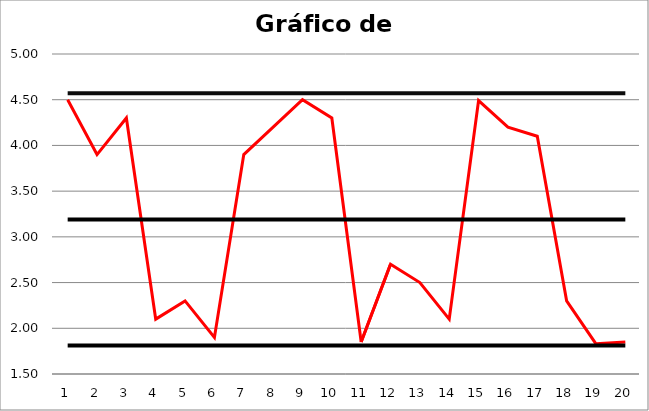
| Category | Promedio | LSC | LCC | LIC |
|---|---|---|---|---|
| 0 | 4.5 | 4.57 | 3.191 | 1.812 |
| 1 | 3.9 | 4.57 | 3.191 | 1.812 |
| 2 | 4.3 | 4.57 | 3.191 | 1.812 |
| 3 | 2.1 | 4.57 | 3.191 | 1.812 |
| 4 | 2.3 | 4.57 | 3.191 | 1.812 |
| 5 | 1.9 | 4.57 | 3.191 | 1.812 |
| 6 | 3.9 | 4.57 | 3.191 | 1.812 |
| 7 | 4.2 | 4.57 | 3.191 | 1.812 |
| 8 | 4.5 | 4.57 | 3.191 | 1.812 |
| 9 | 4.3 | 4.57 | 3.191 | 1.812 |
| 10 | 1.85 | 4.57 | 3.191 | 1.812 |
| 11 | 2.7 | 4.57 | 3.191 | 1.812 |
| 12 | 2.5 | 4.57 | 3.191 | 1.812 |
| 13 | 2.1 | 4.57 | 3.191 | 1.812 |
| 14 | 4.49 | 4.57 | 3.191 | 1.812 |
| 15 | 4.2 | 4.57 | 3.191 | 1.812 |
| 16 | 4.1 | 4.57 | 3.191 | 1.812 |
| 17 | 2.3 | 4.57 | 3.191 | 1.812 |
| 18 | 1.83 | 4.57 | 3.191 | 1.812 |
| 19 | 1.85 | 4.57 | 3.191 | 1.812 |